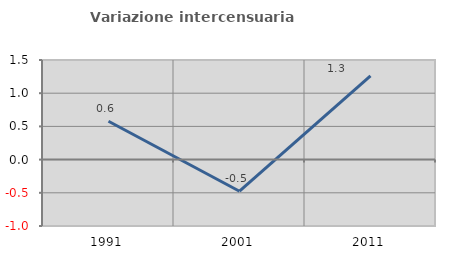
| Category | Variazione intercensuaria annua |
|---|---|
| 1991.0 | 0.577 |
| 2001.0 | -0.476 |
| 2011.0 | 1.261 |